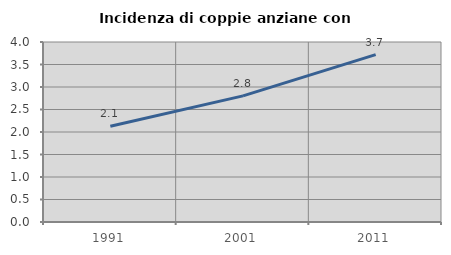
| Category | Incidenza di coppie anziane con figli |
|---|---|
| 1991.0 | 2.127 |
| 2001.0 | 2.803 |
| 2011.0 | 3.72 |